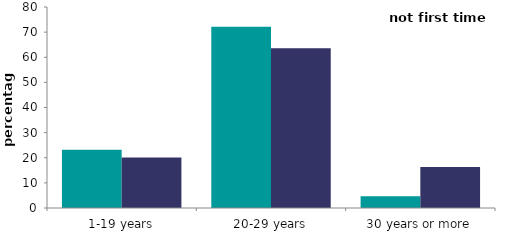
| Category | 2008-09 | 2018-19 |
|---|---|---|
| 1-19 years | 23.188 | 20.092 |
| 20-29 years | 72.115 | 63.615 |
| 30 years or more | 4.697 | 16.293 |